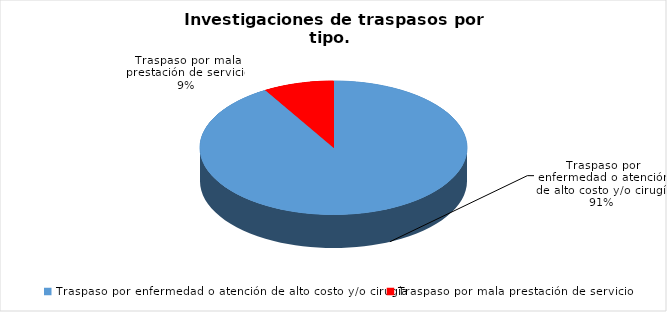
| Category | Series 0 |
|---|---|
| Traspaso por enfermedad o atención de alto costo y/o cirugía | 193 |
| Traspaso por mala prestación de servicio | 18 |